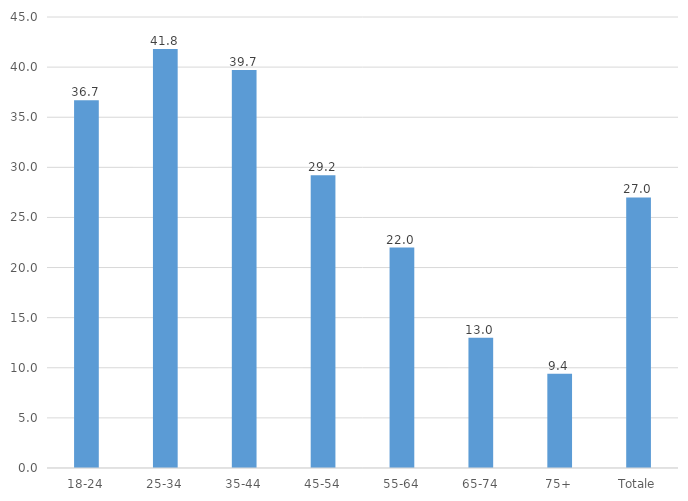
| Category | Hanno dedicato più tempo ai pasti |
|---|---|
| 18-24 | 36.7 |
| 25-34 | 41.8 |
| 35-44 | 39.7 |
| 45-54 | 29.2 |
| 55-64 | 22 |
| 65-74 | 13 |
| 75+ | 9.4 |
| Totale | 27 |